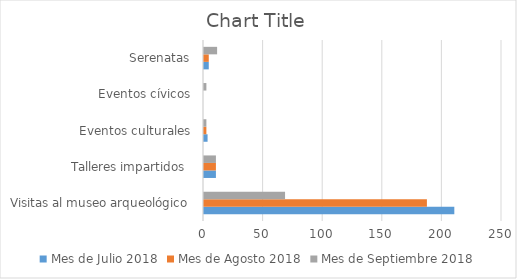
| Category | Mes de Julio 2018 | Mes de Agosto 2018 | Mes de Septiembre 2018 |
|---|---|---|---|
| Visitas al museo arqueológico | 210 | 187 | 68 |
| Talleres impartidos  | 10 | 10 | 10 |
| Eventos culturales | 3 | 2 | 2 |
| Eventos cívicos | 0 | 0 | 2 |
| Serenatas | 4 | 4 | 11 |